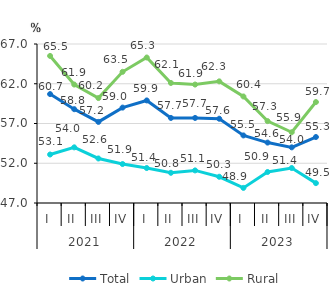
| Category | Total | Urban | Rural |
|---|---|---|---|
| 0 | 60.7 | 53.1 | 65.5 |
| 1 | 58.8 | 54 | 61.9 |
| 2 | 57.2 | 52.6 | 60.2 |
| 3 | 59 | 51.9 | 63.5 |
| 4 | 59.9 | 51.4 | 65.3 |
| 5 | 57.7 | 50.8 | 62.1 |
| 6 | 57.7 | 51.1 | 61.9 |
| 7 | 57.6 | 50.3 | 62.3 |
| 8 | 55.5 | 48.9 | 60.4 |
| 9 | 54.6 | 50.9 | 57.3 |
| 10 | 54 | 51.4 | 55.9 |
| 11 | 55.3 | 49.5 | 59.7 |